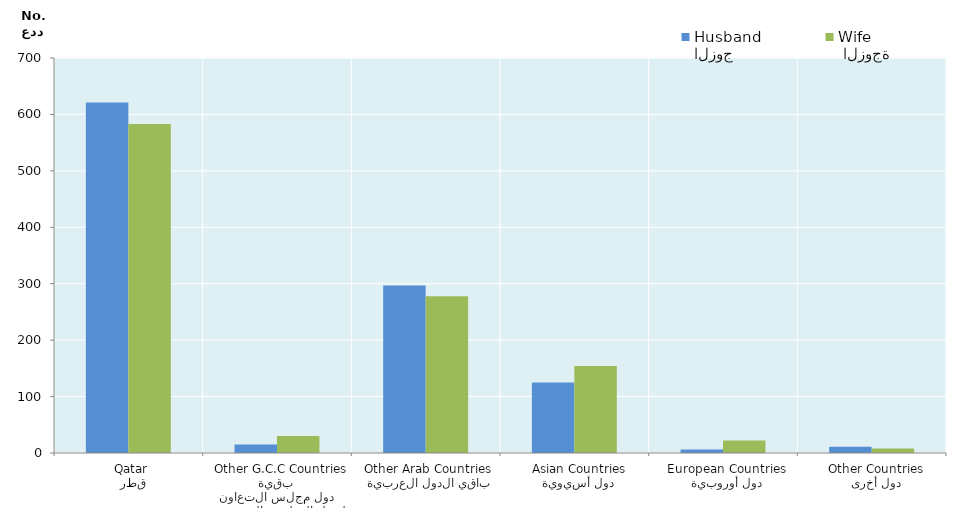
| Category | الزوج
Husband |  الزوجة
Wife |
|---|---|---|
|   قطر
 Qatar | 621 | 583 |
|  بقية دول مجلس التعاون لدول الخليج العربية
  Other G.C.C Countries | 15 | 30 |
|   باقي الدول العربية
 Other Arab Countries | 297 | 278 |
|   دول أسيوية
  Asian Countries | 125 | 154 |
|   دول أوروبية
  European Countries | 6 | 22 |
|   دول أخرى
  Other Countries | 11 | 8 |